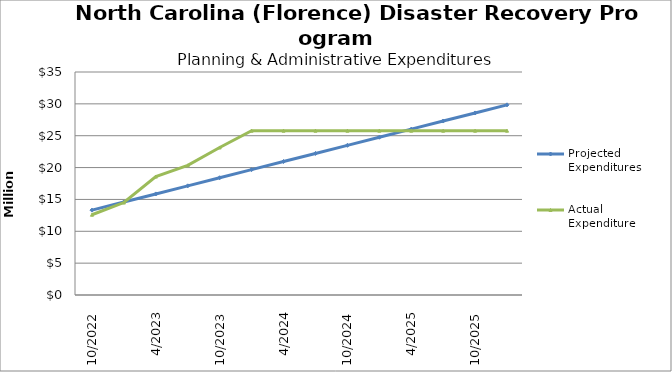
| Category | Projected Expenditures | Actual Expenditure |
|---|---|---|
| 10/2022 | 13319446 | 12595369.76 |
| 1/2023 | 14590675 | 14511875.06 |
| 4/2023 | 15861904 | 18583300.39 |
| 7/2023 | 17133133 | 20340741.63 |
| 10/2023 | 18404362 | 23153615.63 |
| 1/2024 | 19675591 | 25788226.21 |
| 4/2024 | 20946820 | 25788226.21 |
| 7/2024 | 22218049 | 25788226.21 |
| 10/2024 | 23489278 | 25788226.21 |
| 1/2025 | 24760507 | 25788226.21 |
| 4/2025 | 26031736 | 25788226.21 |
| 7/2025 | 27302965 | 25788226.21 |
| 10/2025 | 28574194 | 25788226.21 |
| 1/2026 | 29845420 | 25788226.21 |